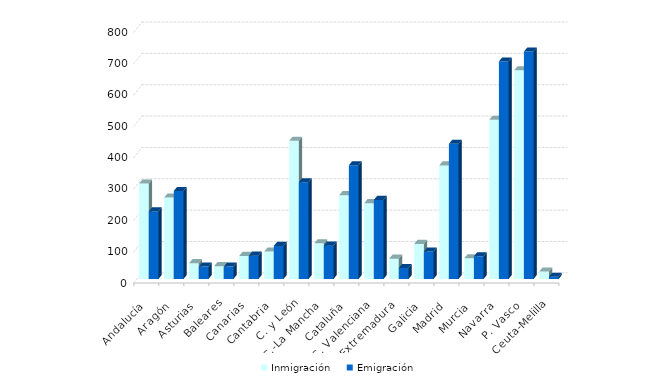
| Category | Inmigración  | Emigración |
|---|---|---|
| Andalucía | 304.476 | 215.585 |
| Aragón | 259.858 | 280.932 |
| Asturias | 50.724 | 39.67 |
| Baleares | 41.151 | 39.619 |
| Canarias | 73.702 | 74.59 |
| Cantabria | 87.613 | 105.669 |
| C. y León | 440.888 | 308.853 |
| C.-La Mancha | 113.772 | 106.456 |
| Cataluña | 267.527 | 362.846 |
| C. Valenciana | 241.941 | 252.289 |
| Extremadura | 64.956 | 35.328 |
| Galicia | 112.082 | 87.873 |
| Madrid | 362.401 | 431.081 |
| Murcia | 66.245 | 72.48 |
| Navarra | 507.83 | 693.943 |
| P. Vasco | 665.974 | 725.291 |
| Ceuta-Melilla | 24 | 7 |